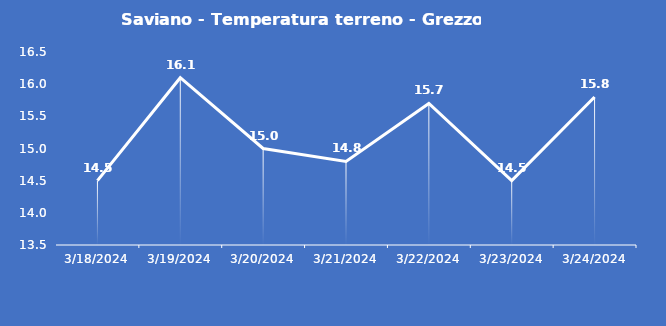
| Category | Saviano - Temperatura terreno - Grezzo (°C) |
|---|---|
| 3/18/24 | 14.5 |
| 3/19/24 | 16.1 |
| 3/20/24 | 15 |
| 3/21/24 | 14.8 |
| 3/22/24 | 15.7 |
| 3/23/24 | 14.5 |
| 3/24/24 | 15.8 |